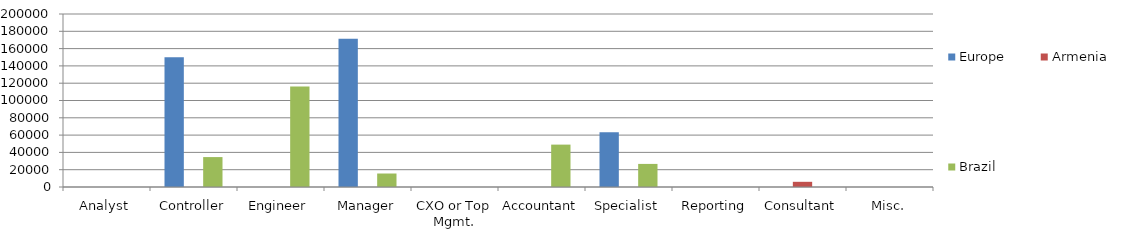
| Category | Europe | Armenia | Brazil | 0 |
|---|---|---|---|---|
| Analyst | 0 | 0 | 0 |  |
| Controller | 149907.134 | 0 | 34591.323 |  |
| Engineer | 0 | 0 | 116050 |  |
| Manager | 171503.924 | 0 | 15600 |  |
| CXO or Top Mgmt. | 0 | 0 | 0 |  |
| Accountant | 0 | 0 | 49000 |  |
| Specialist | 63265.892 | 0 | 26691.183 |  |
| Reporting | 0 | 0 | 0 |  |
| Consultant | 0 | 6000 | 0 |  |
| Misc. | 0 | 0 | 0 |  |